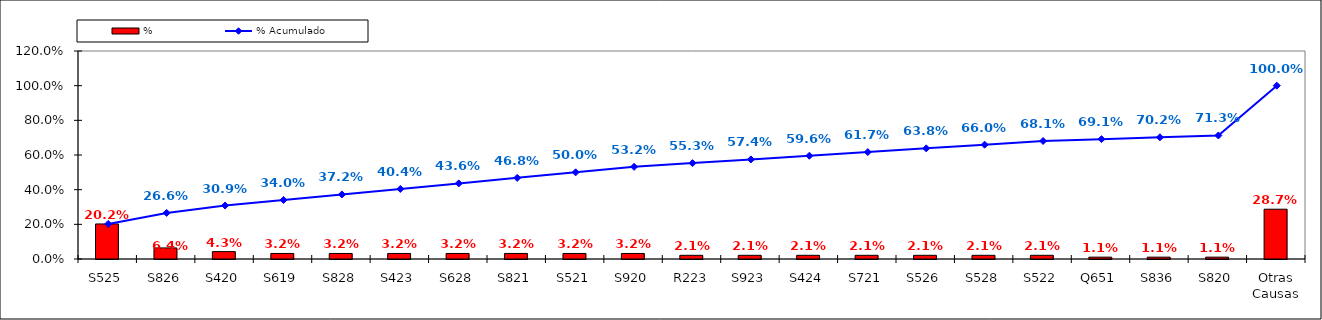
| Category | % |
|---|---|
| S525 | 0.202 |
| S826 | 0.064 |
| S420 | 0.043 |
| S619 | 0.032 |
| S828 | 0.032 |
| S423 | 0.032 |
| S628 | 0.032 |
| S821 | 0.032 |
| S521 | 0.032 |
| S920 | 0.032 |
| R223 | 0.021 |
| S923 | 0.021 |
| S424 | 0.021 |
| S721 | 0.021 |
| S526 | 0.021 |
| S528 | 0.021 |
| S522 | 0.021 |
| Q651 | 0.011 |
| S836 | 0.011 |
| S820 | 0.011 |
| Otras Causas | 0.287 |